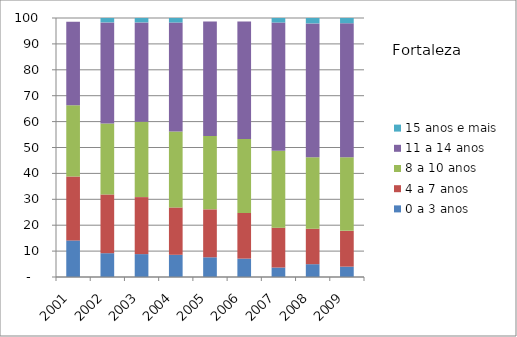
| Category | 0 a 3 anos | 4 a 7 anos | 8 a 10 anos | 11 a 14 anos | 15 anos e mais |
|---|---|---|---|---|---|
| 2001.0 | 14.13 | 24.66 | 27.52 | 32.23 | 0 |
| 2002.0 | 9.19 | 22.68 | 27.42 | 39.02 | 1.69 |
| 2003.0 | 8.84 | 22 | 29.11 | 38.36 | 1.69 |
| 2004.0 | 8.57 | 18.28 | 29.32 | 42.09 | 1.73 |
| 2005.0 | 7.61 | 18.51 | 28.32 | 44.23 | 0 |
| 2006.0 | 7.1 | 17.64 | 28.59 | 45.36 | 0 |
| 2007.0 | 3.66 | 15.4 | 29.73 | 49.47 | 1.74 |
| 2008.0 | 4.95 | 13.7 | 27.59 | 51.68 | 2.09 |
| 2009.0 | 4 | 13.82 | 28.44 | 51.72 | 2.02 |